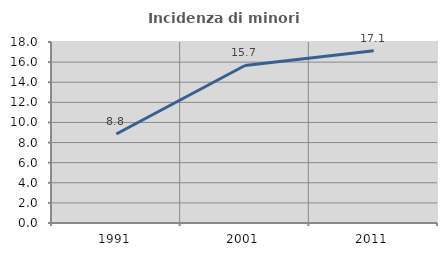
| Category | Incidenza di minori stranieri |
|---|---|
| 1991.0 | 8.85 |
| 2001.0 | 15.668 |
| 2011.0 | 17.121 |